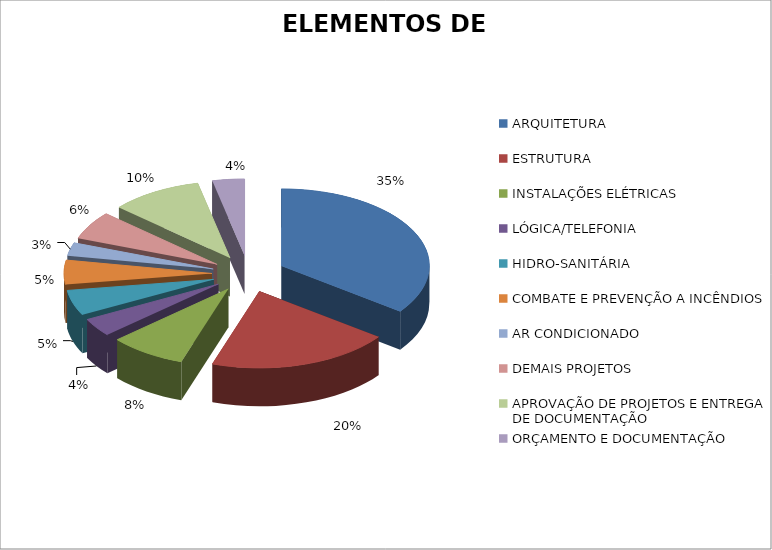
| Category | Series 0 |
|---|---|
| ARQUITETURA | 0.352 |
| ESTRUTURA | 0.2 |
| INSTALAÇÕES ELÉTRICAS | 0.083 |
| LÓGICA/TELEFONIA | 0.038 |
| HIDRO-SANITÁRIA | 0.053 |
| COMBATE E PREVENÇÃO A INCÊNDIOS | 0.051 |
| AR CONDICIONADO | 0.027 |
| DEMAIS PROJETOS | 0.06 |
| APROVAÇÃO DE PROJETOS E ENTREGA DE DOCUMENTAÇÃO | 0.1 |
| ORÇAMENTO E DOCUMENTAÇÃO | 0.035 |